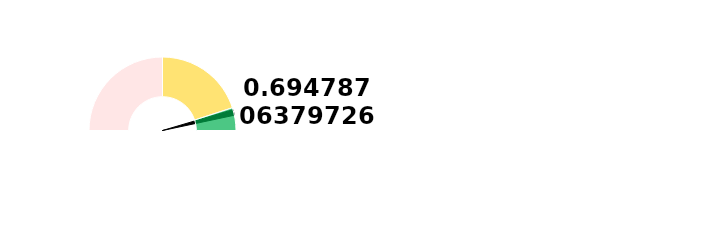
| Category | Ponteiro |
|---|---|
| 0 | 93.057 |
| 1 | 2.5 |
| 2 | 104.443 |